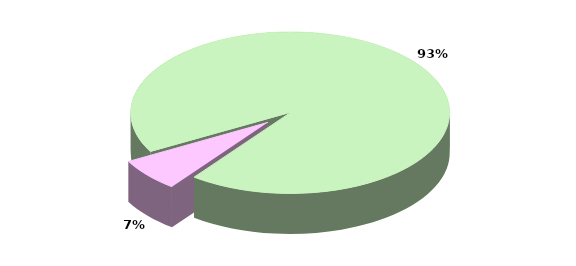
| Category | Series 0 |
|---|---|
| TOTALE ENTRATE CORRENTI | 22451.62 |
| TOTALE ENTRATE IN CONTO CAPITALE | 1599.949 |